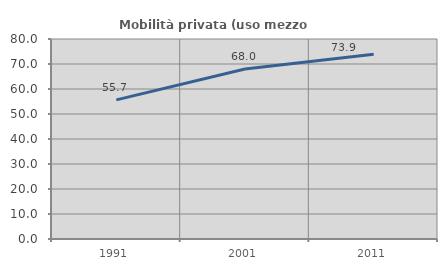
| Category | Mobilità privata (uso mezzo privato) |
|---|---|
| 1991.0 | 55.658 |
| 2001.0 | 68.02 |
| 2011.0 | 73.861 |